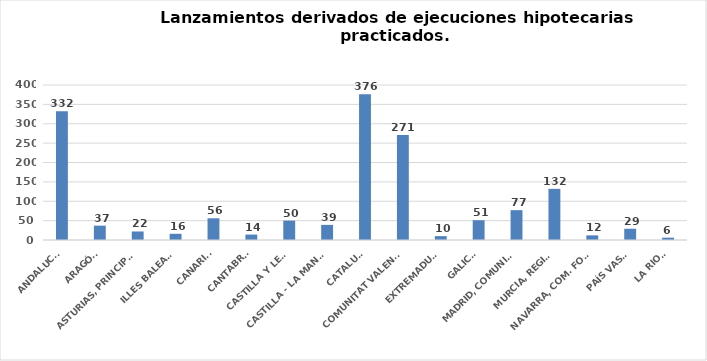
| Category | Series 0 |
|---|---|
| ANDALUCÍA | 332 |
| ARAGÓN | 37 |
| ASTURIAS, PRINCIPADO | 22 |
| ILLES BALEARS | 16 |
| CANARIAS | 56 |
| CANTABRIA | 14 |
| CASTILLA Y LEÓN | 50 |
| CASTILLA - LA MANCHA | 39 |
| CATALUÑA | 376 |
| COMUNITAT VALENCIANA | 271 |
| EXTREMADURA | 10 |
| GALICIA | 51 |
| MADRID, COMUNIDAD | 77 |
| MURCIA, REGIÓN | 132 |
| NAVARRA, COM. FORAL | 12 |
| PAÍS VASCO | 29 |
| LA RIOJA | 6 |